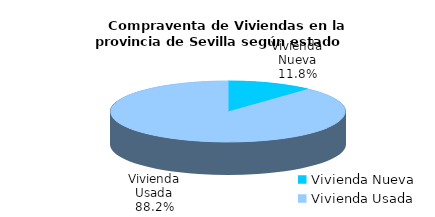
| Category | Series 0 | Series 1 |
|---|---|---|
| Vivienda Nueva | 162 | 0.118 |
| Vivienda Usada | 1210 | 0.882 |